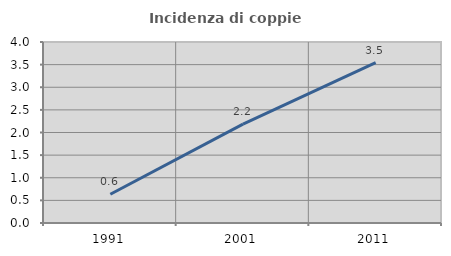
| Category | Incidenza di coppie miste |
|---|---|
| 1991.0 | 0.635 |
| 2001.0 | 2.186 |
| 2011.0 | 3.546 |